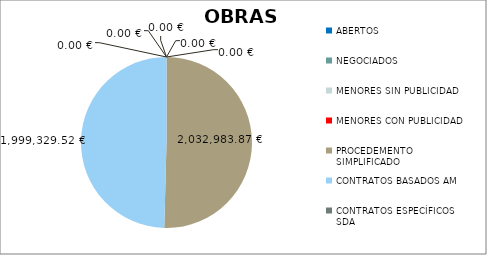
| Category | Series 0 |
|---|---|
| ABERTOS  | 0 |
| NEGOCIADOS  | 0 |
| MENORES SIN PUBLICIDAD | 0 |
| MENORES CON PUBLICIDAD | 0 |
| PROCEDEMENTO SIMPLIFICADO | 2032983.87 |
| CONTRATOS BASADOS AM | 1999329.52 |
| CONTRATOS ESPECÍFICOS SDA | 0 |